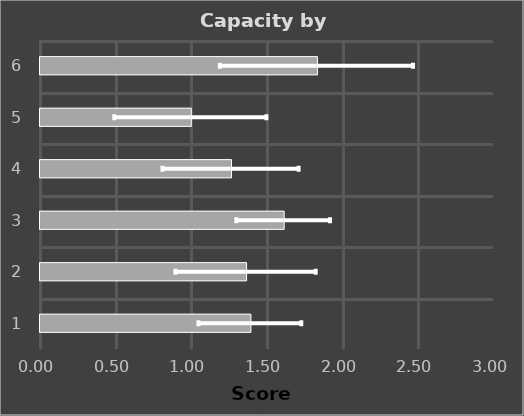
| Category | Series 0 |
|---|---|
| 1.0 | 1.393 |
| 2.0 | 1.365 |
| 3.0 | 1.613 |
| 4.0 | 1.266 |
| 5.0 | 1 |
| 6.0 | 1.833 |